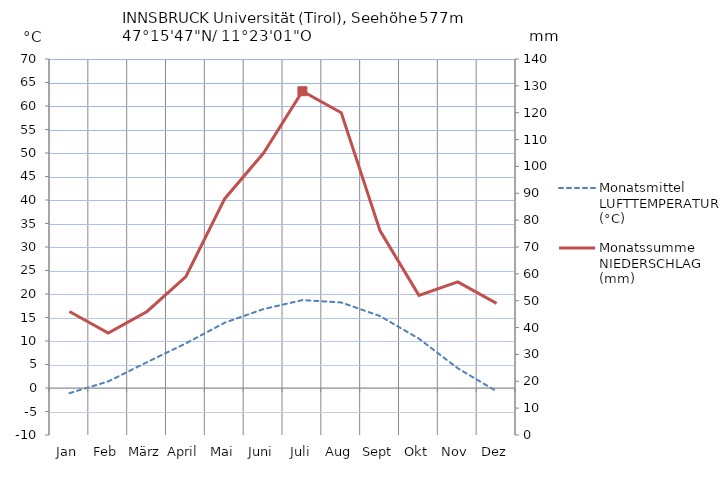
| Category | Monatsmittel |
|---|---|
| Jan | -1.1 |
| Feb | 1.4 |
| März | 5.5 |
| April | 9.5 |
| Mai | 13.9 |
| Juni | 16.8 |
| Juli | 18.7 |
| Aug | 18.2 |
| Sept | 15.3 |
| Okt | 10.5 |
| Nov | 4.2 |
| Dez | -0.7 |